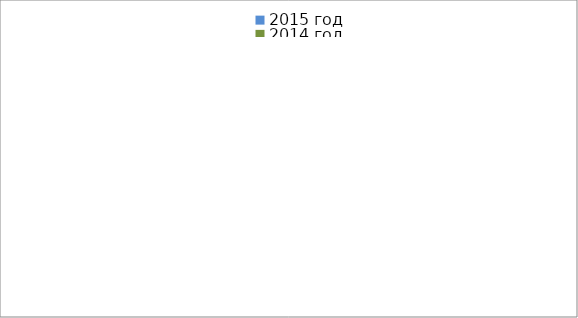
| Category | 2015 год | 2014 год |
|---|---|---|
|  - поджог | 12 | 11 |
|  - неосторожное обращение с огнём | 39 | 22 |
|  - НПТЭ электрооборудования | 7 | 12 |
|  - НПУ и Э печей | 37 | 35 |
|  - НПУ и Э транспортных средств | 33 | 41 |
|   -Шалость с огнем детей | 3 | 0 |
|  -НППБ при эксплуатации эл.приборов | 10 | 15 |
|  - курение | 14 | 16 |
| - прочие | 54 | 70 |
| - не установленные причины | 6 | 7 |